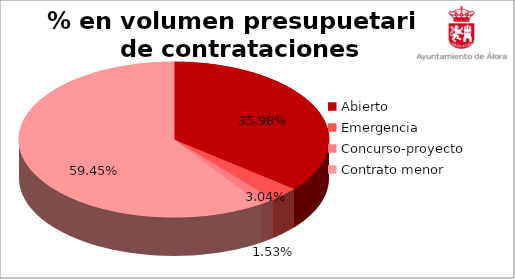
| Category | Series 0 |
|---|---|
| Abierto | 0.36 |
| Emergencia | 0.03 |
| Concurso-proyecto | 0.015 |
| Contrato menor | 0.595 |